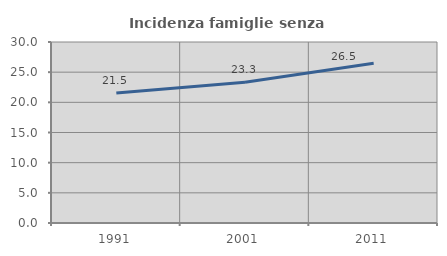
| Category | Incidenza famiglie senza nuclei |
|---|---|
| 1991.0 | 21.537 |
| 2001.0 | 23.336 |
| 2011.0 | 26.462 |